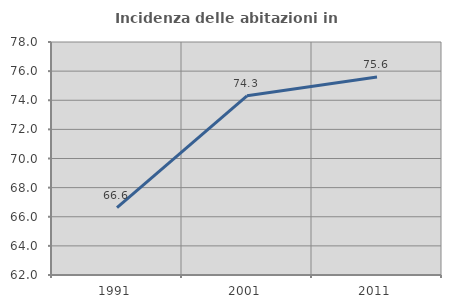
| Category | Incidenza delle abitazioni in proprietà  |
|---|---|
| 1991.0 | 66.623 |
| 2001.0 | 74.305 |
| 2011.0 | 75.603 |